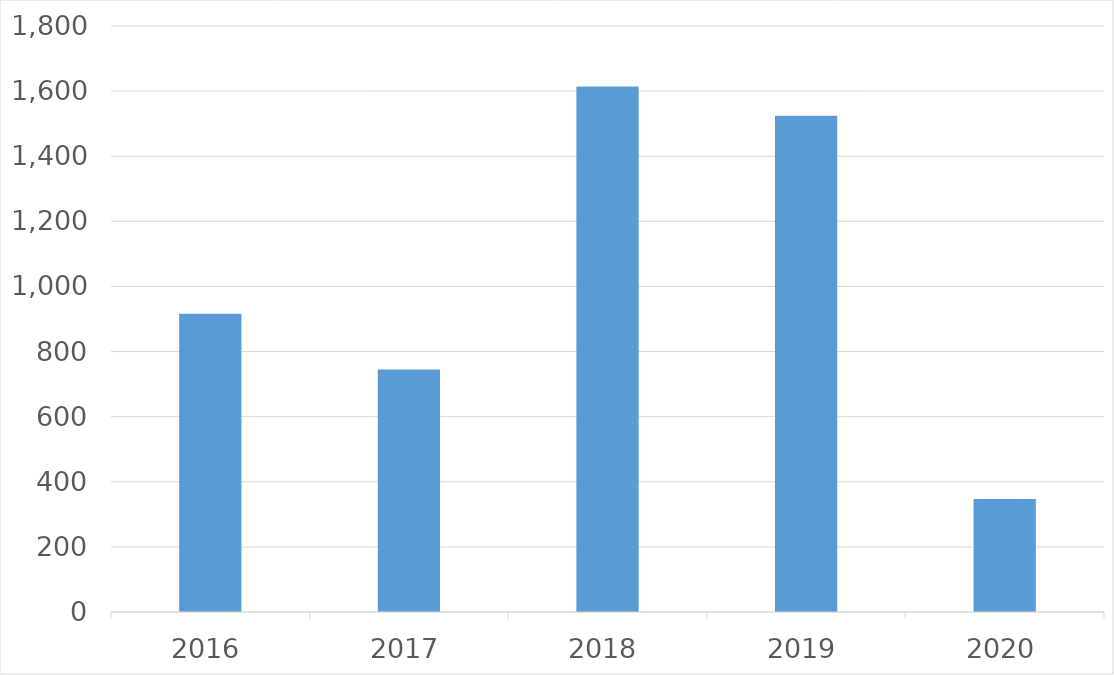
| Category | Series 0 |
|---|---|
| 2016 | 916 |
| 2017 | 745 |
| 2018 | 1614 |
| 2019 | 1524 |
| 2020 | 347 |